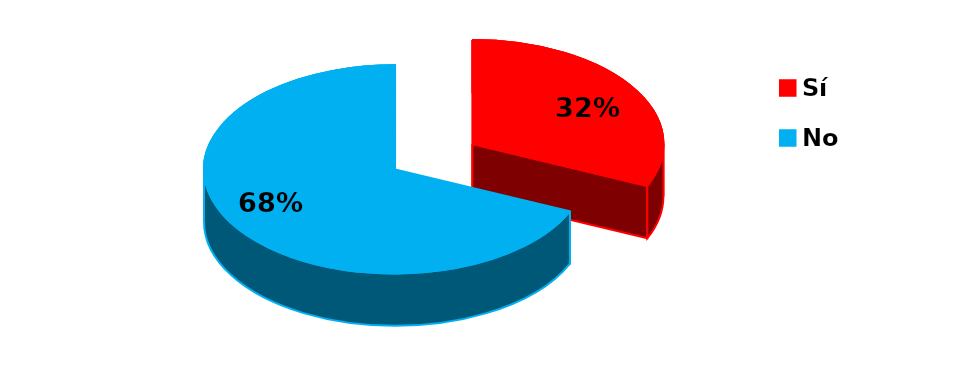
| Category | Series 0 |
|---|---|
| 0 | 6 |
| 1 | 13 |